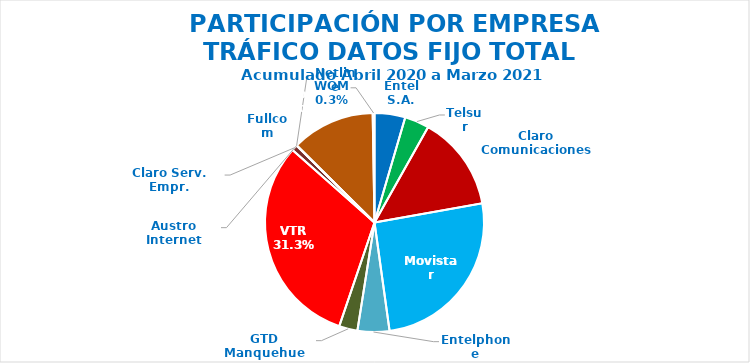
| Category | Series 0 |
|---|---|
| Entel S.A. | 829246.417 |
| Telsur | 662452.954 |
| Claro Comunicaciones | 2573480.913 |
| Movistar | 4689217.895 |
| Entelphone | 860507.213 |
| GTD Manquehue | 497780.621 |
| VTR | 5732863.219 |
| Claro Serv. Empr. | 161825.818 |
| Fullcom | 309.165 |
| Netline | 2726.641 |
| Austro Internet | 177.826 |
| Mundo Pacífico | 2255440.7 |
| WOM | 48828.328 |